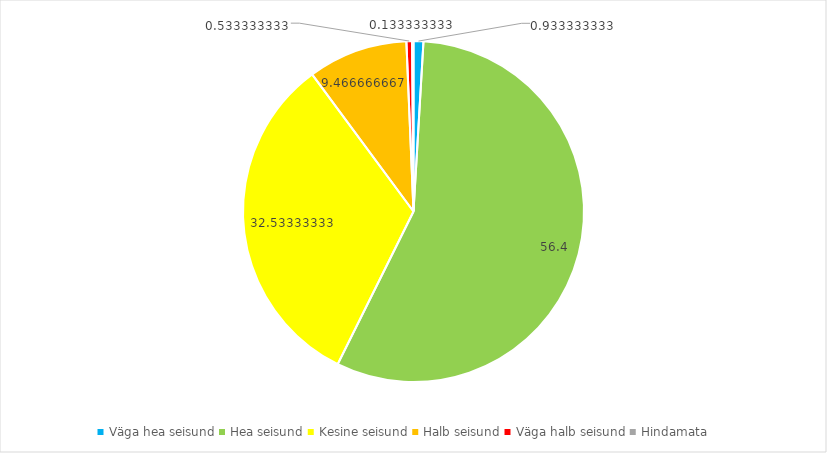
| Category | Series 0 |
|---|---|
| Väga hea seisund | 0.933 |
| Hea seisund | 56.4 |
| Kesine seisund | 32.533 |
| Halb seisund | 9.467 |
| Väga halb seisund | 0.533 |
| Hindamata | 0.133 |